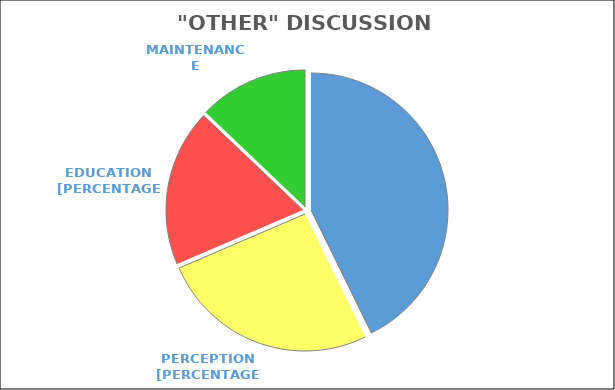
| Category | Series 0 |
|---|---|
| Planning/Objectives | 0.535 |
| Perception | 0.323 |
| Education | 0.232 |
| Maintenance | 0.162 |